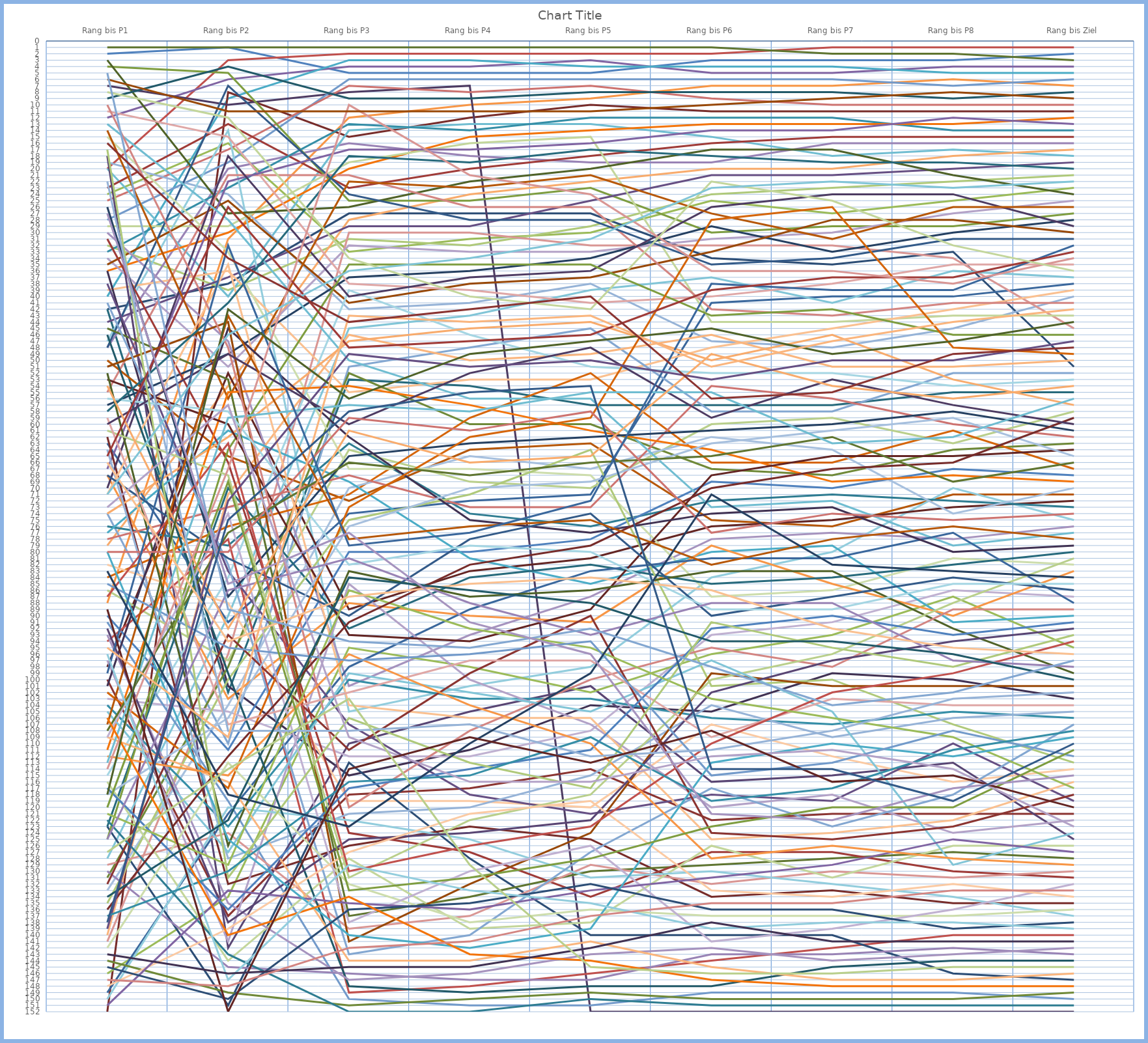
| Category | 1 | 2 | 3 | 4 | 5 | 6 | 7 | 8 | 9 | 10 | 11 | 12 | 13 | 14 | 15 | 16 | 17 | 18 | 19 | 20 | 21 | 22 | 23 | 24 | 25 | 26 | 27 | 28 | 29 | 30 | 31 | 32 | 33 | 34 | 35 | 36 | 37 | 38 | 39 | 40 | 41 | 42 | 43 | 44 | 45 | 46 | 47 | 48 | 49 | 50 | 51 | 52 | 53 | 54 | 55 | 56 | 57 | 58 | 59 | 60 | 61 | 62 | 63 | 64 | 65 | 66 | 67 | 68 | 69 | 70 | 71 | 72 | 73 | 74 | 75 | 76 | 77 | 78 | 79 | 80 | 81 | 82 | 83 | 84 | 85 | 86 | 87 | 88 | 89 | 90 | 91 | 92 | 93 | 94 | 95 | 96 | 97 | 98 | 99 | 100 | 101 | 102 | 103 | 104 | 105 | 106 | 107 | 108 | 109 | 110 | 111 | 112 | 113 | 114 | 115 | 116 | 117 | 118 | 119 | 120 | 121 | 122 | 123 | 124 | 125 | 126 | 127 | 128 | 129 | 130 | 131 | 132 | 133 | 134 | 135 | 136 | 137 | 138 | 139 | 140 | 141 | 142 | 143 | 144 | 145 | 146 | 147 | 148 | 149 | 150 | 151 | 152 |
|---|---|---|---|---|---|---|---|---|---|---|---|---|---|---|---|---|---|---|---|---|---|---|---|---|---|---|---|---|---|---|---|---|---|---|---|---|---|---|---|---|---|---|---|---|---|---|---|---|---|---|---|---|---|---|---|---|---|---|---|---|---|---|---|---|---|---|---|---|---|---|---|---|---|---|---|---|---|---|---|---|---|---|---|---|---|---|---|---|---|---|---|---|---|---|---|---|---|---|---|---|---|---|---|---|---|---|---|---|---|---|---|---|---|---|---|---|---|---|---|---|---|---|---|---|---|---|---|---|---|---|---|---|---|---|---|---|---|---|---|---|---|---|---|---|---|---|---|---|---|---|---|---|
| Rang bis P1 | 2 | 20 | 24 | 12 | 40 | 88 | 42 | 152 | 1 | 7 | 42 | 50 | 28 | 25 | 32 | 48 | 20 | 79 | 63 | 23 | 4 | 44 | 33 | 36 | 19 | 141 | 29 | 34 | 47 | 39 | 57 | 98 | 3 | 36 | 9 | 35 | 74 | 55 | 86 | 30 | 128 | 140 | 48 | 100 | 131 | 18 | 76 | 84 | 133 | 11 | 15 | 103 | 115 | 82 | 90 | 94 | 146 | 67 | 77 | 68 | 123 | 62 | 45 | 70 | 123 | 14 | 91 | 78 | 135 | 130 | 13 | 74 | 149 | 31 | 125 | 38 | 104 | 111 | 64 | 129 | 116 | 97 | 150 | 71 | 26 | 53 | 52 | 101 | 46 | 51 | 41 | 10 | 61 | 93 | 105 | 109 | 68 | 132 | 144 | 92 | 122 | 102 | 118 | 59 | 142 | 109 | 56 | 148 | 117 | 87 | 121 | 151 | 80 | 112 | 145 | 136 | 108 | 60 | 58 | 107 | 85 | 80 | 17 | 125 | 113 | 54 | 99 | 65 | 120 | 139 | 137 | 106 | 22 | 114 | 8 | 73 | 96 | 66 | 83 | 89 | 118 | 143 | 134 | 6 | 5 | 147 | 127 | 27 | 71 | 95 | 138 | 16 |
| Rang bis P2 | 1 | 3 | 16 | 6 | 9 | 31 | 38 | 8 | 1 | 10 | 102 | 65 | 19 | 17 | 39 | 20 | 40 | 54 | 91 | 13 | 5 | 37 | 23 | 30 | 24 | 96 | 29 | 51 | 14 | 36 | 49 | 52 | 27 | 101 | 4 | 25 | 110 | 21 | 97 | 47 | 90 | 71 | 7 | 137 | 98 | 142 | 79 | 76 | 104 | 15 | 33 | 105 | 84 | 88 | 111 | 78 | 134 | 22 | 61 | 103 | 151 | 132 | 53 | 18 | 70 | 56 | 119 | 73 | 100 | 145 | 28 | 62 | 121 | 66 | 64 | 83 | 123 | 55 | 128 | 124 | 144 | 141 | 120 | 35 | 87 | 60 | 126 | 45 | 99 | 44 | 82 | 48 | 68 | 135 | 127 | 116 | 81 | 93 | 149 | 138 | 143 | 117 | 106 | 107 | 113 | 74 | 58 | 139 | 136 | 63 | 129 | 133 | 125 | 115 | 150 | 112 | 77 | 49 | 41 | 43 | 95 | 80 | 131 | 86 | 59 | 92 | 32 | 26 | 69 | 72 | 130 | 140 | 108 | 67 | 12 | 57 | 147 | 94 | 118 | 152 | 42 | 146 | 122 | 11 | 89 | 148 | 114 | 85 | 46 | 109 | 75 | 34 |
| Rang bis P3 | 5 | 2 | 33 | 4 | 3 | 12 | 27 | 15 | 1 | 8 | 53 | 72 | 6 | 7 | 31 | 16 | 14 | 28 | 74 | 23 | 25 | 29 | 13 | 20 | 42 | 30 | 19 | 32 | 105 | 55 | 37 | 89 | 26 | 115 | 9 | 41 | 51 | 21 | 64 | 101 | 45 | 46 | 24 | 118 | 52 | 110 | 63 | 71 | 70 | 38 | 67 | 112 | 39 | 119 | 80 | 149 | 95 | 17 | 69 | 88 | 113 | 126 | 137 | 40 | 92 | 22 | 150 | 68 | 75 | 146 | 50 | 47 | 98 | 124 | 35 | 107 | 100 | 54 | 121 | 139 | 128 | 85 | 122 | 104 | 65 | 93 | 83 | 62 | 148 | 141 | 143 | 120 | 131 | 147 | 99 | 144 | 90 | 111 | 151 | 125 | 152 | 73 | 76 | 102 | 132 | 138 | 82 | 127 | 117 | 130 | 86 | 135 | 140 | 96 | 136 | 91 | 66 | 60 | 18 | 78 | 97 | 59 | 106 | 81 | 57 | 61 | 79 | 48 | 133 | 49 | 116 | 134 | 108 | 10 | 34 | 109 | 129 | 87 | 123 | 114 | 56 | 145 | 84 | 11 | 94 | 142 | 103 | 77 | 36 | 43 | 58 | 44 |
| Rang bis P4 | 5 | 2 | 31 | 4 | 3 | 10 | 27 | 12 | 1 | 7 | 54 | 64 | 6 | 8 | 32 | 18 | 13 | 24 | 72 | 20 | 25 | 29 | 14 | 15 | 41 | 30 | 16 | 33 | 101 | 53 | 36 | 83 | 22 | 111 | 9 | 38 | 48 | 26 | 69 | 93 | 43 | 50 | 28 | 117 | 60 | 105 | 74 | 59 | 65 | 39 | 67 | 112 | 46 | 119 | 80 | 148 | 98 | 17 | 81 | 90 | 128 | 123 | 134 | 37 | 84 | 23 | 151 | 73 | 71 | 147 | 56 | 45 | 89 | 127 | 35 | 118 | 103 | 57 | 120 | 137 | 139 | 100 | 125 | 106 | 63 | 94 | 87 | 75 | 149 | 132 | 140 | 108 | 122 | 146 | 102 | 144 | 78 | 99 | 150 | 124 | 152 | 62 | 70 | 97 | 138 | 130 | 79 | 121 | 114 | 126 | 92 | 136 | 142 | 104 | 135 | 82 | 68 | 52 | 19 | 76 | 96 | 61 | 113 | 88 | 58 | 66 | 77 | 47 | 131 | 51 | 115 | 143 | 107 | 21 | 40 | 116 | 133 | 85 | 110 | 109 | 49 | 145 | 86 | 11 | 95 | 141 | 129 | 91 | 34 | 44 | 55 | 42 |
| Rang bis P5 | 5 | 2 | 30 | 3 | 4 | 9 | 27 | 10 | 1 | 152 | 57 | 63 | 6 | 7 | 29 | 19 | 13 | 22 | 71 | 18 | 23 | 25 | 12 | 14 | 38 | 32 | 15 | 33 | 98 | 53 | 34 | 81 | 20 | 104 | 8 | 37 | 45 | 26 | 70 | 87 | 39 | 49 | 28 | 114 | 60 | 101 | 76 | 52 | 67 | 41 | 68 | 108 | 51 | 120 | 78 | 146 | 102 | 16 | 85 | 91 | 140 | 125 | 130 | 36 | 82 | 21 | 151 | 73 | 64 | 147 | 56 | 44 | 83 | 134 | 35 | 121 | 103 | 61 | 115 | 129 | 138 | 107 | 131 | 106 | 62 | 89 | 86 | 77 | 148 | 124 | 127 | 100 | 118 | 143 | 105 | 141 | 74 | 90 | 149 | 122 | 150 | 59 | 69 | 97 | 136 | 126 | 80 | 119 | 111 | 123 | 95 | 133 | 139 | 110 | 132 | 79 | 66 | 48 | 17 | 75 | 94 | 58 | 117 | 93 | 55 | 65 | 72 | 46 | 128 | 50 | 109 | 144 | 112 | 24 | 42 | 116 | 135 | 84 | 99 | 113 | 47 | 142 | 88 | 11 | 92 | 137 | 145 | 96 | 31 | 43 | 54 | 40 |
| Rang bis P6 | 3 | 2 | 25 | 5 | 4 | 7 | 34 | 11 | 1 | 152 | 57 | 75 | 6 | 9 | 24 | 19 | 15 | 20 | 41 | 16 | 30 | 21 | 12 | 13 | 47 | 32 | 44 | 31 | 84 | 48 | 29 | 76 | 17 | 105 | 8 | 33 | 58 | 42 | 60 | 78 | 37 | 46 | 35 | 122 | 67 | 116 | 72 | 66 | 62 | 40 | 87 | 93 | 52 | 107 | 69 | 144 | 96 | 14 | 80 | 79 | 140 | 134 | 129 | 26 | 85 | 27 | 149 | 54 | 101 | 143 | 73 | 50 | 81 | 127 | 43 | 118 | 106 | 64 | 104 | 132 | 126 | 120 | 130 | 125 | 61 | 68 | 83 | 74 | 148 | 99 | 117 | 95 | 100 | 142 | 97 | 145 | 90 | 124 | 150 | 102 | 151 | 28 | 63 | 109 | 137 | 141 | 89 | 133 | 92 | 110 | 103 | 131 | 113 | 128 | 136 | 70 | 65 | 59 | 18 | 82 | 115 | 77 | 91 | 88 | 55 | 49 | 38 | 39 | 123 | 53 | 119 | 147 | 111 | 36 | 22 | 112 | 139 | 86 | 71 | 108 | 45 | 138 | 94 | 10 | 98 | 135 | 146 | 121 | 23 | 51 | 114 | 56 |
| Rang bis P7 | 3 | 1 | 27 | 5 | 4 | 7 | 35 | 11 | 2 | 152 | 57 | 76 | 6 | 10 | 23 | 16 | 18 | 20 | 40 | 15 | 29 | 21 | 12 | 13 | 48 | 32 | 44 | 30 | 80 | 45 | 33 | 75 | 17 | 99 | 8 | 28 | 58 | 43 | 59 | 77 | 41 | 51 | 34 | 121 | 68 | 115 | 71 | 66 | 64 | 38 | 86 | 91 | 52 | 112 | 70 | 142 | 93 | 14 | 79 | 85 | 140 | 133 | 128 | 24 | 84 | 31 | 149 | 56 | 100 | 143 | 72 | 46 | 81 | 127 | 42 | 119 | 107 | 69 | 109 | 130 | 131 | 118 | 132 | 124 | 60 | 65 | 83 | 73 | 145 | 101 | 123 | 98 | 96 | 144 | 105 | 147 | 87 | 125 | 150 | 97 | 151 | 26 | 61 | 103 | 137 | 139 | 89 | 134 | 90 | 102 | 106 | 129 | 110 | 126 | 136 | 67 | 62 | 53 | 19 | 78 | 113 | 74 | 95 | 88 | 63 | 54 | 39 | 37 | 120 | 50 | 117 | 148 | 108 | 36 | 25 | 111 | 138 | 92 | 82 | 116 | 49 | 141 | 94 | 9 | 104 | 135 | 146 | 122 | 22 | 47 | 114 | 55 |
| Rang bis P8 | 3 | 1 | 25 | 4 | 5 | 6 | 33 | 11 | 2 | 152 | 55 | 71 | 7 | 10 | 22 | 16 | 17 | 18 | 40 | 15 | 29 | 20 | 14 | 13 | 45 | 34 | 43 | 27 | 70 | 42 | 30 | 73 | 21 | 100 | 9 | 28 | 52 | 41 | 63 | 78 | 36 | 51 | 31 | 121 | 64 | 113 | 72 | 61 | 74 | 35 | 81 | 86 | 54 | 116 | 67 | 140 | 87 | 12 | 91 | 90 | 146 | 135 | 127 | 24 | 82 | 26 | 149 | 60 | 107 | 142 | 79 | 53 | 77 | 130 | 46 | 110 | 105 | 68 | 106 | 131 | 126 | 124 | 134 | 122 | 58 | 65 | 92 | 80 | 144 | 101 | 118 | 89 | 88 | 143 | 129 | 147 | 84 | 123 | 150 | 94 | 151 | 48 | 59 | 104 | 137 | 136 | 85 | 132 | 93 | 99 | 109 | 125 | 112 | 128 | 139 | 66 | 69 | 57 | 19 | 76 | 108 | 75 | 98 | 97 | 62 | 56 | 39 | 37 | 120 | 50 | 111 | 148 | 103 | 38 | 32 | 114 | 138 | 95 | 83 | 115 | 47 | 141 | 96 | 8 | 102 | 133 | 145 | 117 | 23 | 44 | 119 | 49 |
| Rang bis Ziel | 2 | 1 | 23 | 4 | 5 | 7 | 51 | 11 | 3 | 152 | 55 | 71 | 6 | 10 | 21 | 16 | 18 | 17 | 38 | 15 | 27 | 19 | 14 | 12 | 40 | 45 | 43 | 25 | 75 | 39 | 28 | 72 | 24 | 103 | 8 | 30 | 52 | 41 | 58 | 76 | 37 | 50 | 31 | 121 | 63 | 125 | 73 | 67 | 70 | 35 | 82 | 87 | 53 | 114 | 68 | 140 | 95 | 13 | 90 | 83 | 147 | 135 | 128 | 29 | 80 | 26 | 150 | 62 | 113 | 143 | 77 | 57 | 88 | 131 | 46 | 119 | 106 | 69 | 105 | 130 | 126 | 122 | 137 | 116 | 61 | 64 | 99 | 79 | 144 | 101 | 107 | 89 | 81 | 142 | 124 | 146 | 86 | 118 | 149 | 92 | 151 | 49 | 65 | 104 | 136 | 132 | 85 | 134 | 91 | 94 | 117 | 127 | 109 | 129 | 138 | 59 | 66 | 60 | 20 | 78 | 112 | 74 | 93 | 98 | 56 | 54 | 32 | 33 | 111 | 47 | 108 | 148 | 102 | 34 | 36 | 123 | 139 | 96 | 84 | 120 | 44 | 141 | 100 | 9 | 97 | 133 | 145 | 115 | 22 | 42 | 110 | 48 |